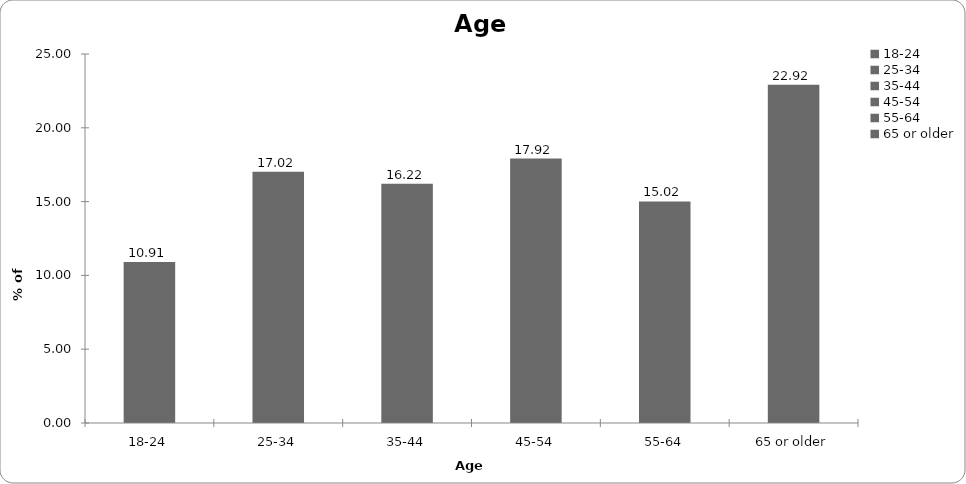
| Category | Age |
|---|---|
| 18-24 | 10.911 |
| 25-34 | 17.017 |
| 35-44 | 16.216 |
| 45-54 | 17.918 |
| 55-64 | 15.015 |
| 65 or older | 22.923 |